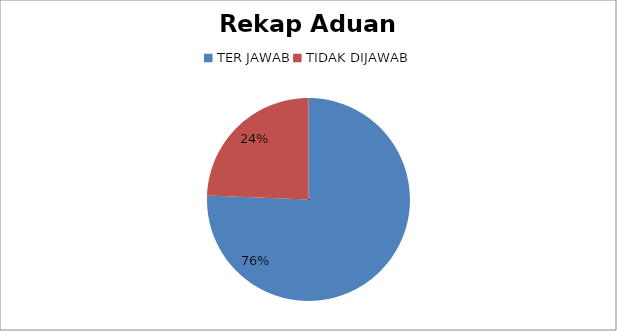
| Category | Series 0 |
|---|---|
| TER JAWAB | 93 |
| TIDAK DIJAWAB | 30 |